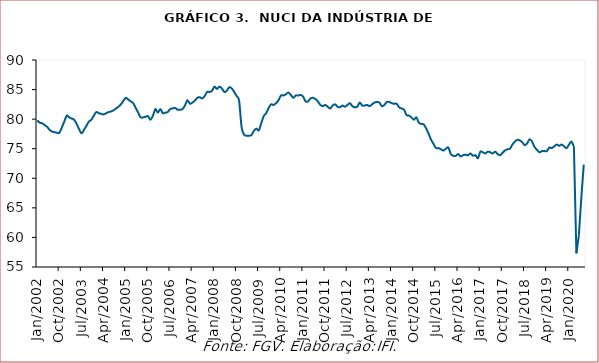
| Category | Nuci |
|---|---|
| 2002-01-01 | 79.8 |
| 2002-02-01 | 79.4 |
| 2002-03-01 | 79.3 |
| 2002-04-01 | 79 |
| 2002-05-01 | 78.7 |
| 2002-06-01 | 78.2 |
| 2002-07-01 | 77.9 |
| 2002-08-01 | 77.8 |
| 2002-09-01 | 77.7 |
| 2002-10-01 | 77.7 |
| 2002-11-01 | 78.6 |
| 2002-12-01 | 79.6 |
| 2003-01-01 | 80.6 |
| 2003-02-01 | 80.3 |
| 2003-03-01 | 80.1 |
| 2003-04-01 | 79.9 |
| 2003-05-01 | 79.2 |
| 2003-06-01 | 78.3 |
| 2003-07-01 | 77.6 |
| 2003-08-01 | 78.2 |
| 2003-09-01 | 78.9 |
| 2003-10-01 | 79.6 |
| 2003-11-01 | 79.9 |
| 2003-12-01 | 80.6 |
| 2004-01-01 | 81.2 |
| 2004-02-01 | 81 |
| 2004-03-01 | 80.9 |
| 2004-04-01 | 80.8 |
| 2004-05-01 | 81 |
| 2004-06-01 | 81.2 |
| 2004-07-01 | 81.3 |
| 2004-08-01 | 81.5 |
| 2004-09-01 | 81.8 |
| 2004-10-01 | 82.1 |
| 2004-11-01 | 82.5 |
| 2004-12-01 | 83.1 |
| 2005-01-01 | 83.6 |
| 2005-02-01 | 83.3 |
| 2005-03-01 | 83 |
| 2005-04-01 | 82.7 |
| 2005-05-01 | 81.9 |
| 2005-06-01 | 81.1 |
| 2005-07-01 | 80.3 |
| 2005-08-01 | 80.3 |
| 2005-09-01 | 80.4 |
| 2005-10-01 | 80.5 |
| 2005-11-01 | 79.9 |
| 2005-12-01 | 80.6 |
| 2006-01-01 | 81.7 |
| 2006-02-01 | 81.1 |
| 2006-03-01 | 81.7 |
| 2006-04-01 | 81 |
| 2006-05-01 | 81.1 |
| 2006-06-01 | 81.2 |
| 2006-07-01 | 81.7 |
| 2006-08-01 | 81.8 |
| 2006-09-01 | 81.9 |
| 2006-10-01 | 81.6 |
| 2006-11-01 | 81.6 |
| 2006-12-01 | 81.7 |
| 2007-01-01 | 82.3 |
| 2007-02-01 | 83.2 |
| 2007-03-01 | 82.6 |
| 2007-04-01 | 82.8 |
| 2007-05-01 | 83.1 |
| 2007-06-01 | 83.6 |
| 2007-07-01 | 83.7 |
| 2007-08-01 | 83.5 |
| 2007-09-01 | 83.9 |
| 2007-10-01 | 84.6 |
| 2007-11-01 | 84.6 |
| 2007-12-01 | 84.8 |
| 2008-01-01 | 85.5 |
| 2008-02-01 | 85.1 |
| 2008-03-01 | 85.5 |
| 2008-04-01 | 85.2 |
| 2008-05-01 | 84.6 |
| 2008-06-01 | 84.8 |
| 2008-07-01 | 85.4 |
| 2008-08-01 | 85.2 |
| 2008-09-01 | 84.6 |
| 2008-10-01 | 83.9 |
| 2008-11-01 | 83.1 |
| 2008-12-01 | 78.7 |
| 2009-01-01 | 77.4 |
| 2009-02-01 | 77.2 |
| 2009-03-01 | 77.2 |
| 2009-04-01 | 77.3 |
| 2009-05-01 | 78 |
| 2009-06-01 | 78.4 |
| 2009-07-01 | 78.1 |
| 2009-08-01 | 79.3 |
| 2009-09-01 | 80.5 |
| 2009-10-01 | 81 |
| 2009-11-01 | 81.9 |
| 2009-12-01 | 82.5 |
| 2010-01-01 | 82.4 |
| 2010-02-01 | 82.7 |
| 2010-03-01 | 83.2 |
| 2010-04-01 | 84 |
| 2010-05-01 | 84 |
| 2010-06-01 | 84.2 |
| 2010-07-01 | 84.5 |
| 2010-08-01 | 84.1 |
| 2010-09-01 | 83.6 |
| 2010-10-01 | 84 |
| 2010-11-01 | 84 |
| 2010-12-01 | 84.1 |
| 2011-01-01 | 83.8 |
| 2011-02-01 | 83 |
| 2011-03-01 | 83 |
| 2011-04-01 | 83.5 |
| 2011-05-01 | 83.6 |
| 2011-06-01 | 83.4 |
| 2011-07-01 | 83 |
| 2011-08-01 | 82.4 |
| 2011-09-01 | 82.2 |
| 2011-10-01 | 82.4 |
| 2011-11-01 | 82.1 |
| 2011-12-01 | 81.8 |
| 2012-01-01 | 82.3 |
| 2012-02-01 | 82.5 |
| 2012-03-01 | 82.1 |
| 2012-04-01 | 82 |
| 2012-05-01 | 82.3 |
| 2012-06-01 | 82.1 |
| 2012-07-01 | 82.4 |
| 2012-08-01 | 82.7 |
| 2012-09-01 | 82.2 |
| 2012-10-01 | 82 |
| 2012-11-01 | 82.1 |
| 2012-12-01 | 82.8 |
| 2013-01-01 | 82.3 |
| 2013-02-01 | 82.3 |
| 2013-03-01 | 82.4 |
| 2013-04-01 | 82.2 |
| 2013-05-01 | 82.5 |
| 2013-06-01 | 82.8 |
| 2013-07-01 | 82.9 |
| 2013-08-01 | 82.8 |
| 2013-09-01 | 82.2 |
| 2013-10-01 | 82.4 |
| 2013-11-01 | 82.9 |
| 2013-12-01 | 82.9 |
| 2014-01-01 | 82.7 |
| 2014-02-01 | 82.6 |
| 2014-03-01 | 82.6 |
| 2014-04-01 | 82 |
| 2014-05-01 | 81.8 |
| 2014-06-01 | 81.6 |
| 2014-07-01 | 80.7 |
| 2014-08-01 | 80.6 |
| 2014-09-01 | 80.3 |
| 2014-10-01 | 79.9 |
| 2014-11-01 | 80.3 |
| 2014-12-01 | 79.4 |
| 2015-01-01 | 79.2 |
| 2015-02-01 | 79.1 |
| 2015-03-01 | 78.4 |
| 2015-04-01 | 77.5 |
| 2015-05-01 | 76.5 |
| 2015-06-01 | 75.8 |
| 2015-07-01 | 75.1 |
| 2015-08-01 | 75.1 |
| 2015-09-01 | 74.9 |
| 2015-10-01 | 74.7 |
| 2015-11-01 | 75 |
| 2015-12-01 | 75.2 |
| 2016-01-01 | 74.1 |
| 2016-02-01 | 73.8 |
| 2016-03-01 | 73.8 |
| 2016-04-01 | 74.1 |
| 2016-05-01 | 73.7 |
| 2016-06-01 | 73.9 |
| 2016-07-01 | 74 |
| 2016-08-01 | 73.9 |
| 2016-09-01 | 74.2 |
| 2016-10-01 | 73.8 |
| 2016-11-01 | 73.9 |
| 2016-12-01 | 73.4 |
| 2017-01-01 | 74.5 |
| 2017-02-01 | 74.4 |
| 2017-03-01 | 74.2 |
| 2017-04-01 | 74.5 |
| 2017-05-01 | 74.4 |
| 2017-06-01 | 74.2 |
| 2017-07-01 | 74.5 |
| 2017-08-01 | 74.1 |
| 2017-09-01 | 73.9 |
| 2017-10-01 | 74.3 |
| 2017-11-01 | 74.7 |
| 2017-12-01 | 74.9 |
| 2018-01-01 | 75 |
| 2018-02-01 | 75.7 |
| 2018-03-01 | 76.2 |
| 2018-04-01 | 76.5 |
| 2018-05-01 | 76.4 |
| 2018-06-01 | 76.1 |
| 2018-07-01 | 75.6 |
| 2018-08-01 | 75.9 |
| 2018-09-01 | 76.6 |
| 2018-10-01 | 76.2 |
| 2018-11-01 | 75.3 |
| 2018-12-01 | 74.8 |
| 2019-01-01 | 74.4 |
| 2019-02-01 | 74.6 |
| 2019-03-01 | 74.6 |
| 2019-04-01 | 74.6 |
| 2019-05-01 | 75.2 |
| 2019-06-01 | 75.1 |
| 2019-07-01 | 75.4 |
| 2019-08-01 | 75.7 |
| 2019-09-01 | 75.5 |
| 2019-10-01 | 75.7 |
| 2019-11-01 | 75.4 |
| 2019-12-01 | 75.1 |
| 2020-01-01 | 75.7 |
| 2020-02-01 | 76.2 |
| 2020-03-01 | 75.3 |
| 2020-04-01 | 57.3 |
| 2020-05-01 | 60.3 |
| 2020-06-01 | 66.6 |
| 2020-07-01 | 72.3 |